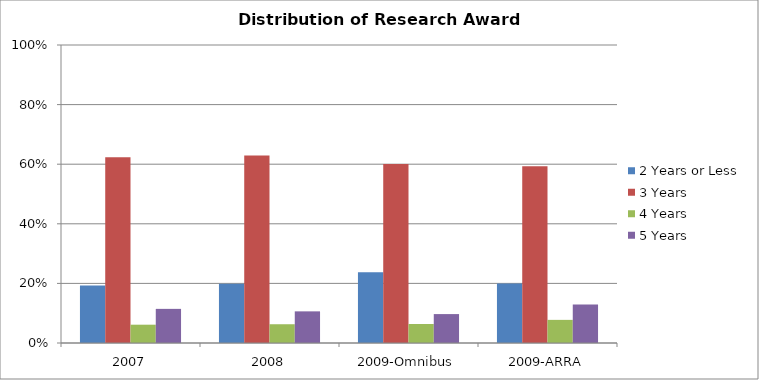
| Category | 2 Years or Less | 3 Years | 4 Years | 5 Years |
|---|---|---|---|---|
| 2007 | 0.193 | 0.623 | 0.061 | 0.115 |
| 2008 | 0.199 | 0.629 | 0.063 | 0.106 |
| 2009-Omnibus | 0.237 | 0.6 | 0.064 | 0.097 |
| 2009-ARRA | 0.2 | 0.593 | 0.078 | 0.13 |